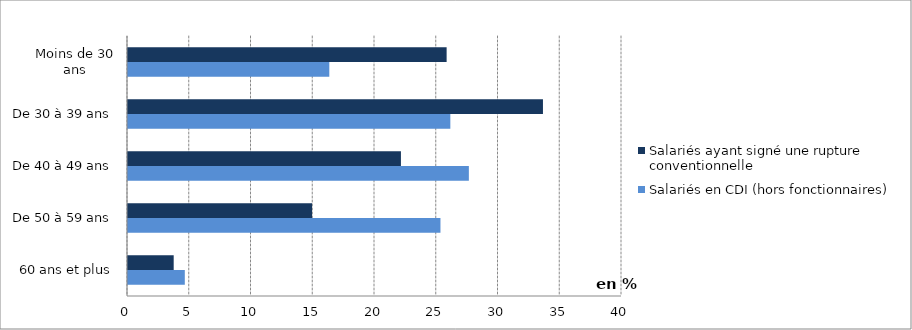
| Category | Salariés en CDI (hors fonctionnaires) | Salariés ayant signé une rupture conventionnelle |
|---|---|---|
| 60 ans et plus | 4.6 | 3.7 |
| De 50 à 59 ans | 25.3 | 14.9 |
| De 40 à 49 ans | 27.6 | 22.1 |
| De 30 à 39 ans | 26.1 | 33.6 |
| Moins de 30 ans | 16.3 | 25.8 |